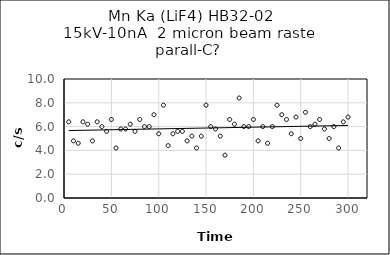
| Category | Series 0 |
|---|---|
| 5.0 | 6.4 |
| 10.0 | 4.8 |
| 15.0 | 4.6 |
| 20.0 | 6.4 |
| 25.0 | 6.2 |
| 30.0 | 4.8 |
| 35.0 | 6.4 |
| 40.0 | 6 |
| 45.0 | 5.6 |
| 50.0 | 6.6 |
| 55.0 | 4.2 |
| 60.0 | 5.8 |
| 65.0 | 5.8 |
| 70.0 | 6.2 |
| 75.0 | 5.6 |
| 80.0 | 6.6 |
| 85.0 | 6 |
| 90.0 | 6 |
| 95.0 | 7 |
| 100.0 | 5.4 |
| 105.0 | 7.8 |
| 110.0 | 4.4 |
| 115.0 | 5.4 |
| 120.0 | 5.6 |
| 125.0 | 5.6 |
| 130.0 | 4.8 |
| 135.0 | 5.2 |
| 140.0 | 4.2 |
| 145.0 | 5.2 |
| 150.0 | 7.8 |
| 155.0 | 6 |
| 160.0 | 5.8 |
| 165.0 | 5.2 |
| 170.0 | 3.6 |
| 175.0 | 6.6 |
| 180.0 | 6.2 |
| 185.0 | 8.4 |
| 190.0 | 6 |
| 195.0 | 6 |
| 200.0 | 6.6 |
| 205.0 | 4.8 |
| 210.0 | 6 |
| 215.0 | 4.6 |
| 220.0 | 6 |
| 225.0 | 7.8 |
| 230.0 | 7 |
| 235.0 | 6.6 |
| 240.0 | 5.4 |
| 245.0 | 6.8 |
| 250.0 | 5 |
| 255.0 | 7.2 |
| 260.0 | 6 |
| 265.0 | 6.2 |
| 270.0 | 6.6 |
| 275.0 | 5.8 |
| 280.0 | 5 |
| 285.0 | 6 |
| 290.0 | 4.2 |
| 295.0 | 6.4 |
| 300.0 | 6.8 |